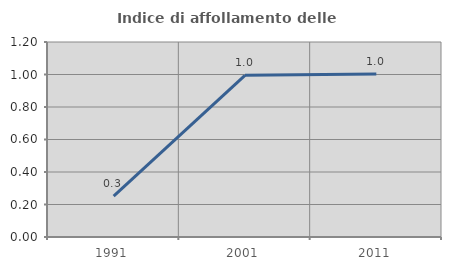
| Category | Indice di affollamento delle abitazioni  |
|---|---|
| 1991.0 | 0.252 |
| 2001.0 | 0.995 |
| 2011.0 | 1.003 |